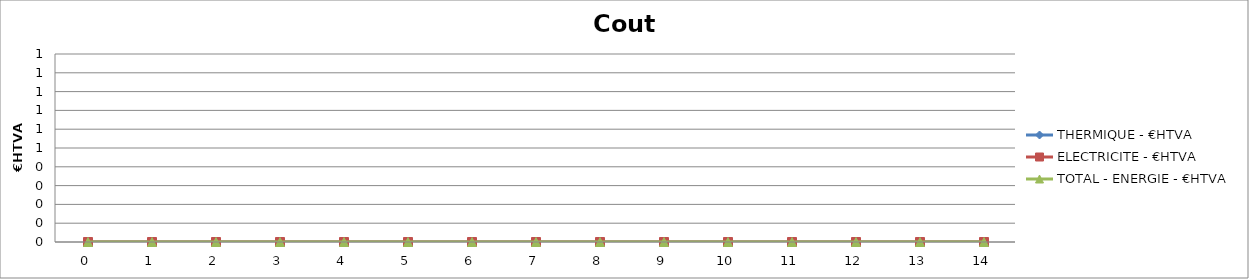
| Category | THERMIQUE - €HTVA | ELECTRICITE - €HTVA | TOTAL - ENERGIE - €HTVA |
|---|---|---|---|
| 0.0 | 0 | 0 | 0 |
| 1.0 | 0 | 0 | 0 |
| 2.0 | 0 | 0 | 0 |
| 3.0 | 0 | 0 | 0 |
| 4.0 | 0 | 0 | 0 |
| 5.0 | 0 | 0 | 0 |
| 6.0 | 0 | 0 | 0 |
| 7.0 | 0 | 0 | 0 |
| 8.0 | 0 | 0 | 0 |
| 9.0 | 0 | 0 | 0 |
| 10.0 | 0 | 0 | 0 |
| 11.0 | 0 | 0 | 0 |
| 12.0 | 0 | 0 | 0 |
| 13.0 | 0 | 0 | 0 |
| 14.0 | 0 | 0 | 0 |